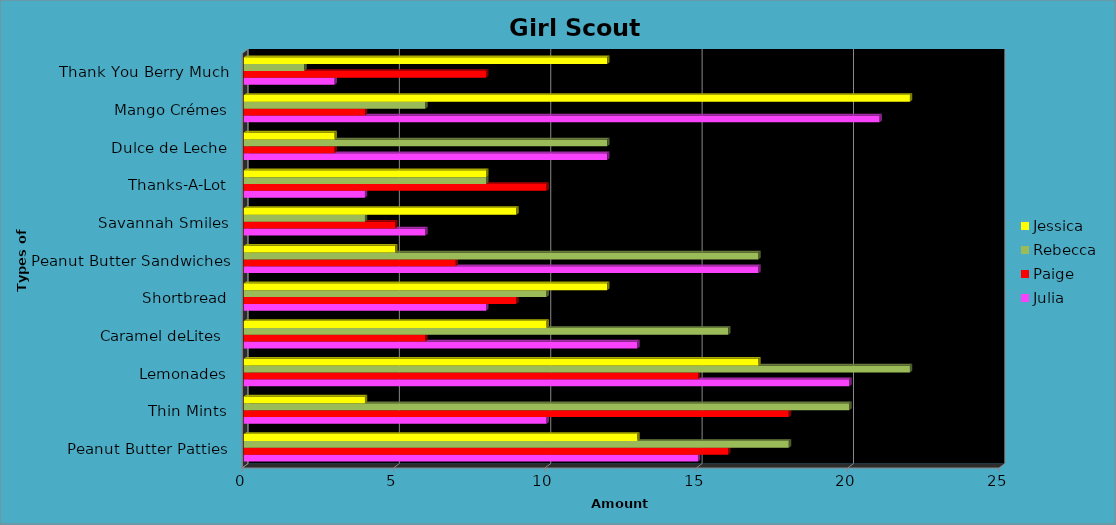
| Category | Julia | Paige | Rebecca | Jessica |
|---|---|---|---|---|
| Peanut Butter Patties | 15 | 16 | 18 | 13 |
| Thin Mints | 10 | 18 | 20 | 4 |
| Lemonades | 20 | 15 | 22 | 17 |
| Caramel deLites  | 13 | 6 | 16 | 10 |
| Shortbread | 8 | 9 | 10 | 12 |
| Peanut Butter Sandwiches | 17 | 7 | 17 | 5 |
| Savannah Smiles | 6 | 5 | 4 | 9 |
| Thanks-A-Lot | 4 | 10 | 8 | 8 |
| Dulce de Leche | 12 | 3 | 12 | 3 |
| Mango Crémes | 21 | 4 | 6 | 22 |
| Thank You Berry Much | 3 | 8 | 2 | 12 |